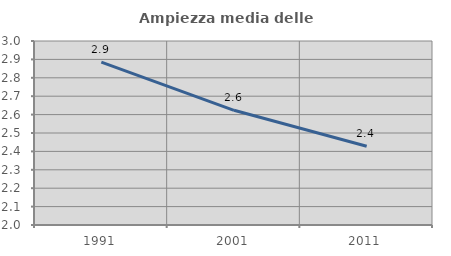
| Category | Ampiezza media delle famiglie |
|---|---|
| 1991.0 | 2.885 |
| 2001.0 | 2.623 |
| 2011.0 | 2.428 |